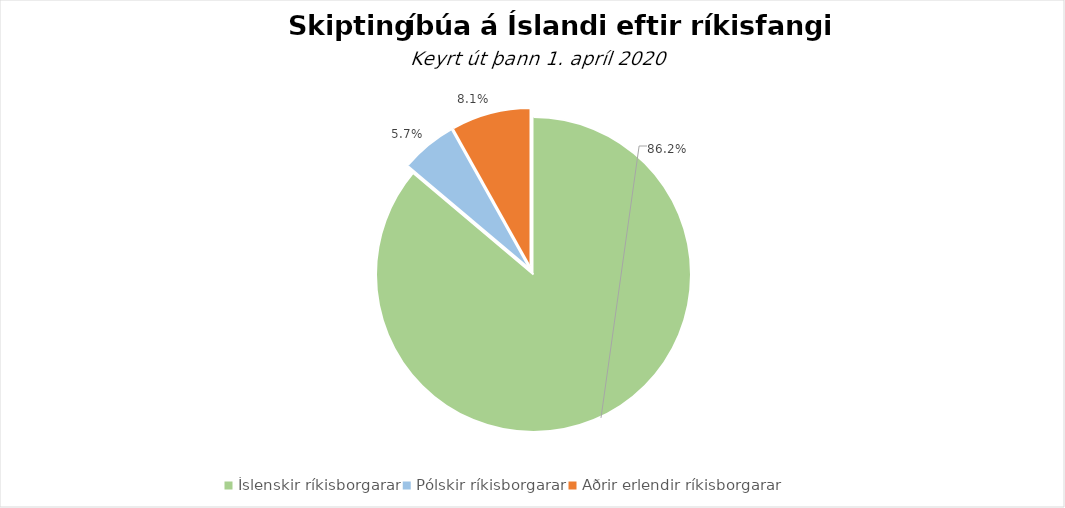
| Category | Series 0 |
|---|---|
| Íslenskir ríkisborgarar | 0.862 |
| Pólskir ríkisborgarar | 0.057 |
| Aðrir erlendir ríkisborgarar | 0.081 |